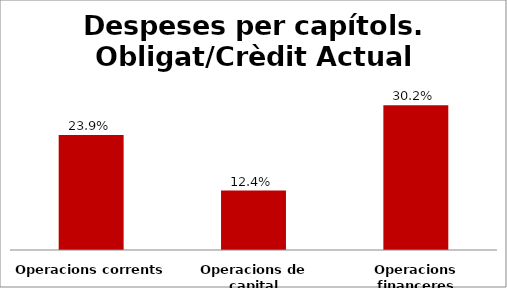
| Category | Series 0 |
|---|---|
| Operacions corrents | 0.239 |
| Operacions de capital | 0.124 |
| Operacions financeres | 0.302 |